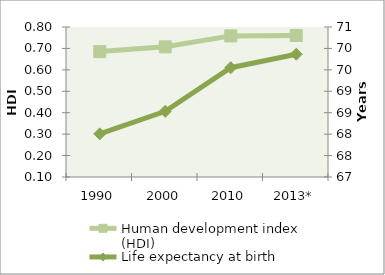
| Category | Human development index (HDI) |
|---|---|
| 1990 | 0.685 |
| 2000 | 0.707 |
| 2010 | 0.758 |
| 2013* | 0.76 |